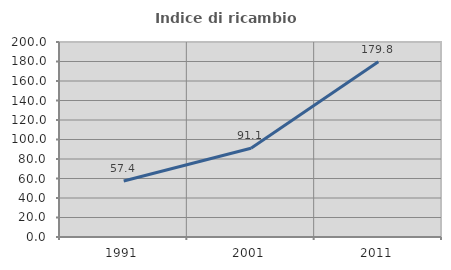
| Category | Indice di ricambio occupazionale  |
|---|---|
| 1991.0 | 57.416 |
| 2001.0 | 91.061 |
| 2011.0 | 179.808 |